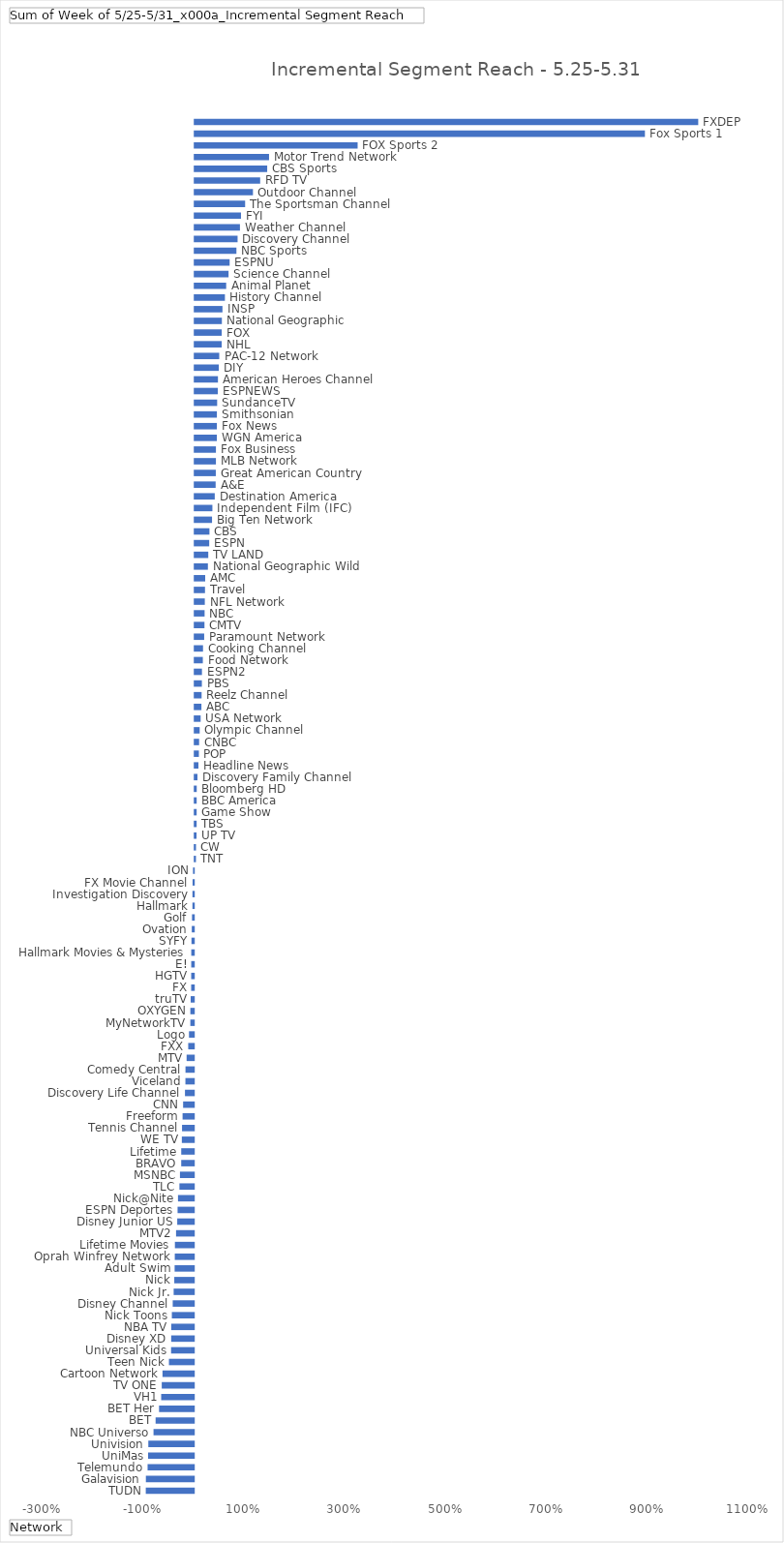
| Category | Total |
|---|---|
| TUDN | -0.953 |
| Galavision | -0.951 |
| Telemundo | -0.917 |
| UniMas | -0.907 |
| Univision | -0.902 |
| NBC Universo | -0.799 |
| BET | -0.758 |
| BET Her | -0.689 |
| VH1 | -0.647 |
| TV ONE | -0.636 |
| Cartoon Network | -0.621 |
| Teen Nick | -0.493 |
| Universal Kids | -0.451 |
| Disney XD | -0.449 |
| NBA TV | -0.448 |
| Nick Toons | -0.435 |
| Disney Channel | -0.418 |
| Nick Jr. | -0.399 |
| Nick | -0.387 |
| Adult Swim | -0.38 |
| Oprah Winfrey Network | -0.377 |
| Lifetime Movies | -0.375 |
| MTV2 | -0.352 |
| Disney Junior US | -0.329 |
| ESPN Deportes | -0.322 |
| Nick@Nite | -0.313 |
| TLC | -0.285 |
| MSNBC | -0.274 |
| BRAVO | -0.249 |
| Lifetime | -0.249 |
| WE TV | -0.237 |
| Tennis Channel | -0.233 |
| Freeform | -0.223 |
| CNN | -0.212 |
| Discovery Life Channel | -0.175 |
| Viceland | -0.166 |
| Comedy Central | -0.165 |
| MTV | -0.142 |
| FXX | -0.11 |
| Logo | -0.095 |
| MyNetworkTV | -0.069 |
| OXYGEN | -0.068 |
| truTV | -0.062 |
| FX | -0.052 |
| HGTV | -0.052 |
| E! | -0.051 |
| Hallmark Movies & Mysteries | -0.05 |
| SYFY | -0.046 |
| Ovation | -0.04 |
| Golf | -0.035 |
| Hallmark | -0.027 |
| Investigation Discovery | -0.027 |
| FX Movie Channel | -0.024 |
| ION | -0.016 |
| TNT | 0.024 |
| CW | 0.025 |
| UP TV | 0.035 |
| TBS | 0.037 |
| Game Show | 0.038 |
| BBC America | 0.038 |
| Bloomberg HD | 0.039 |
| Discovery Family Channel | 0.054 |
| Headline News | 0.072 |
| POP | 0.082 |
| CNBC | 0.086 |
| Olympic Channel | 0.098 |
| USA Network | 0.117 |
| ABC | 0.132 |
| Reelz Channel | 0.136 |
| PBS | 0.141 |
| ESPN2 | 0.143 |
| Food Network | 0.16 |
| Cooking Channel | 0.164 |
| Paramount Network | 0.187 |
| CMTV | 0.193 |
| NBC | 0.195 |
| NFL Network | 0.199 |
| Travel | 0.203 |
| AMC | 0.208 |
| National Geographic Wild | 0.261 |
| TV LAND | 0.268 |
| ESPN | 0.287 |
| CBS | 0.292 |
| Big Ten Network | 0.343 |
| Independent Film (IFC) | 0.35 |
| Destination America | 0.397 |
| A&E | 0.414 |
| Great American Country | 0.418 |
| MLB Network | 0.42 |
| Fox Business | 0.42 |
| WGN America | 0.438 |
| Fox News | 0.439 |
| Smithsonian | 0.439 |
| SundanceTV | 0.444 |
| ESPNEWS | 0.456 |
| American Heroes Channel | 0.46 |
| DIY | 0.477 |
| PAC-12 Network | 0.486 |
| NHL | 0.535 |
| FOX | 0.535 |
| National Geographic | 0.538 |
| INSP | 0.55 |
| History Channel | 0.599 |
| Animal Planet | 0.624 |
| Science Channel | 0.67 |
| ESPNU | 0.692 |
| NBC Sports | 0.827 |
| Discovery Channel | 0.85 |
| Weather Channel | 0.897 |
| FYI | 0.917 |
| The Sportsman Channel | 0.999 |
| Outdoor Channel | 1.155 |
| RFD TV | 1.298 |
| CBS Sports | 1.437 |
| Motor Trend Network | 1.474 |
| FOX Sports 2 | 3.232 |
| Fox Sports 1 | 8.932 |
| FXDEP | 9.99 |